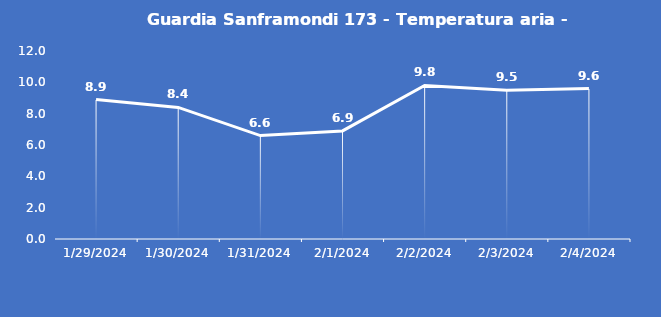
| Category | Guardia Sanframondi 173 - Temperatura aria - Grezzo (°C) |
|---|---|
| 1/29/24 | 8.9 |
| 1/30/24 | 8.4 |
| 1/31/24 | 6.6 |
| 2/1/24 | 6.9 |
| 2/2/24 | 9.8 |
| 2/3/24 | 9.5 |
| 2/4/24 | 9.6 |